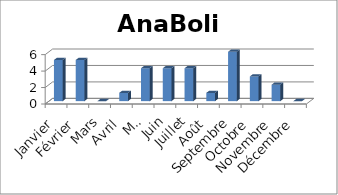
| Category | AnaBolic |
|---|---|
| Janvier | 5 |
| Février | 5 |
| Mars | 0 |
| Avril | 1 |
| Mai | 4 |
| Juin | 4 |
| Juillet | 4 |
| Août | 1 |
| Septembre | 6 |
| Octobre | 3 |
| Novembre | 2 |
| Décembre | 0 |